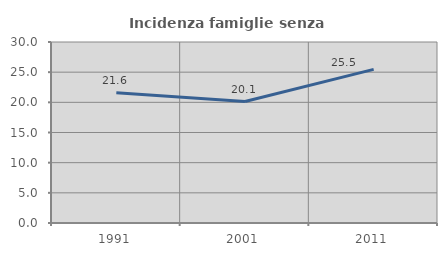
| Category | Incidenza famiglie senza nuclei |
|---|---|
| 1991.0 | 21.585 |
| 2001.0 | 20.129 |
| 2011.0 | 25.461 |